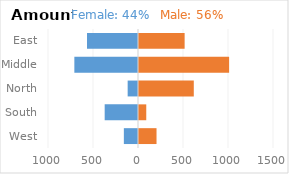
| Category | Female | Male |
|---|---|---|
| East | -566.6 | 518.1 |
| Middle | -707.2 | 1012.4 |
| North | -114.9 | 619.9 |
| South | -370.2 | 91.8 |
| West | -157.2 | 205.8 |